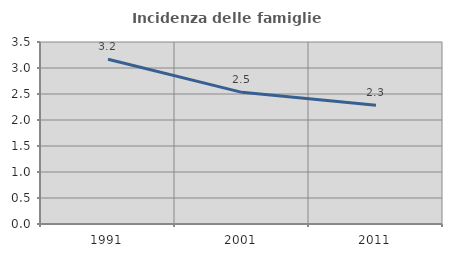
| Category | Incidenza delle famiglie numerose |
|---|---|
| 1991.0 | 3.168 |
| 2001.0 | 2.532 |
| 2011.0 | 2.283 |